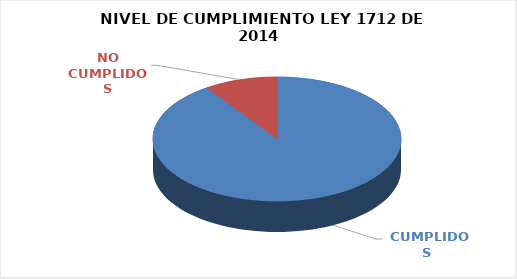
| Category | Series 0 |
|---|---|
|  CUMPLIDOS | 104 |
| NO CUMPLIDOS | 11 |